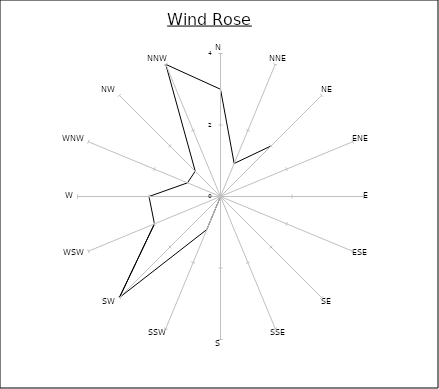
| Category | Series 0 |
|---|---|
| N | 3 |
| NNE | 1 |
| NE | 2 |
| ENE | 0 |
| E | 1 |
| ESE | 0 |
| SE | 0 |
| SSE | 0 |
| S | 0 |
| SSW | 1 |
| SW | 4 |
| WSW | 2 |
| W | 2 |
| WNW | 1 |
| NW | 1 |
| NNW | 4 |